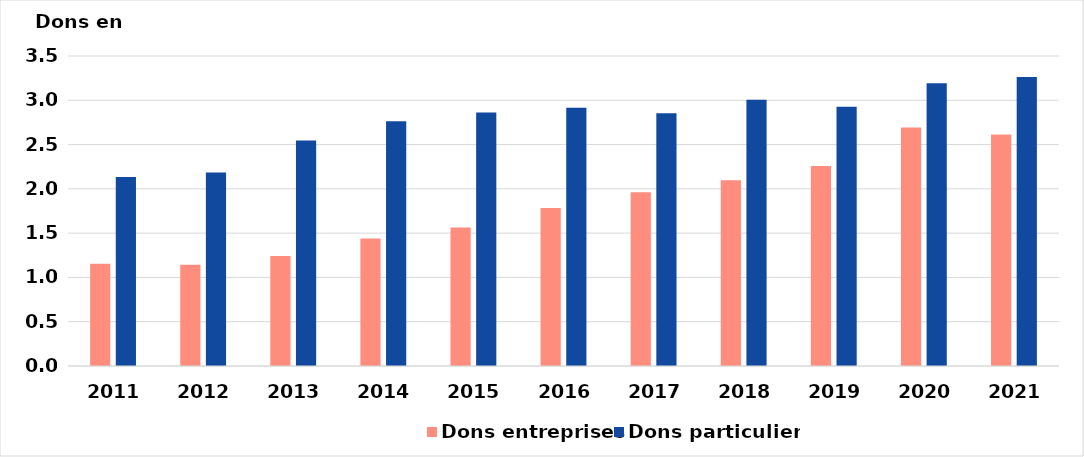
| Category | Dons entreprises | Dons particuliers |
|---|---|---|
| 2011.0 | 1.153 | 2.135 |
| 2012.0 | 1.143 | 2.184 |
| 2013.0 | 1.242 | 2.547 |
| 2014.0 | 1.439 | 2.765 |
| 2015.0 | 1.564 | 2.861 |
| 2016.0 | 1.784 | 2.915 |
| 2017.0 | 1.962 | 2.853 |
| 2018.0 | 2.096 | 3.007 |
| 2019.0 | 2.258 | 2.926 |
| 2020.0 | 2.693 | 3.191 |
| 2021.0 | 2.613 | 3.264 |